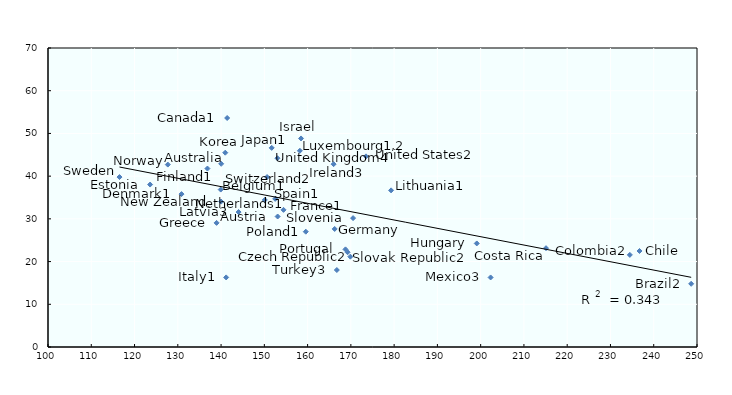
| Category | Population with tertiary education |
|---|---|
| 140.028 | 42.889 |
| 153.076 | 30.551 |
| 139.916 | 36.855 |
| 248.656 | 14.795 |
| 141.411 | 53.615 |
| 236.713 | 22.475 |
| 234.48 | 21.563 |
| 215.105 | 23.136 |
| 169.247 | 22.187 |
| 130.862 | 35.801 |
| 123.599 | 38.031 |
| 136.85 | 41.777 |
| 154.434 | 32.105 |
| 166.26 | 27.638 |
| 138.964 | 29.057 |
| 199.099 | 24.243 |
| 166.01 | 42.806 |
| 158.482 | 48.824 |
| 141.178 | 16.29 |
| 151.701 | 46.619 |
| 140.974 | 45.491 |
| 144.048 | 31.592 |
| 179.301 | 36.668 |
| 158.217 | 45.936 |
| 202.299 | 16.279 |
| 150.101 | 34.42 |
| 140.014 | 34.041 |
| 127.693 | 42.707 |
| 159.581 | 26.995 |
| 168.758 | 22.858 |
| 169.88 | 21.15 |
| 170.518 | 30.173 |
| 152.507 | 34.679 |
| 116.528 | 39.787 |
| 150.634 | 39.783 |
| 166.757 | 18.02 |
| 153.031 | 44.198 |
| 173.501 | 44.629 |